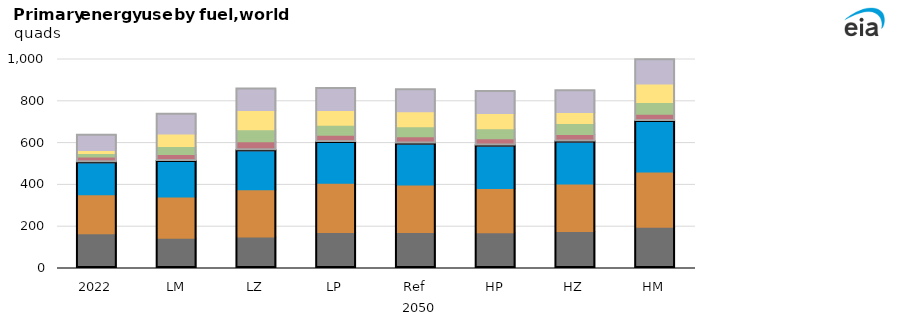
| Category | Coal | Liquids | Natural Gas | Nuclear | Wind | Solar | Other renewables |
|---|---|---|---|---|---|---|---|
| 2022 | 166.02 | 186.457 | 153.26 | 27.72 | 17.14 | 14.34 | 72.903 |
| LM | 144.95 | 197.138 | 169.51 | 33.38 | 39.15 | 58.91 | 95.522 |
| LZ | 150.16 | 226.978 | 186.73 | 43.17 | 57.1 | 91.79 | 103.212 |
| LP | 172.04 | 235.751 | 195.04 | 34.89 | 47.36 | 71.21 | 104.589 |
| Ref | 172.12 | 226.978 | 197 | 34.73 | 47.92 | 71.01 | 104.982 |
| HP | 171.31 | 211.949 | 203.41 | 34.38 | 47.2 | 73.34 | 104.871 |
| HZ | 176.71 | 227.248 | 201.8 | 35.87 | 52.38 | 52.17 | 104.022 |
| HM | 197.2 | 265.028 | 240.65 | 35.01 | 55.89 | 89.45 | 116.172 |